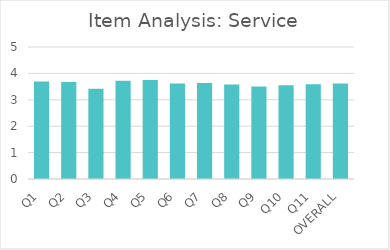
| Category | Series 0 |
|---|---|
| Q1 | 3.69 |
| Q2 | 3.67 |
| Q3 | 3.42 |
| Q4 | 3.72 |
| Q5 | 3.75 |
| Q6 | 3.62 |
| Q7 | 3.64 |
| Q8 | 3.58 |
| Q9 | 3.5 |
| Q10 | 3.55 |
| Q11 | 3.59 |
| OVERALL | 3.62 |